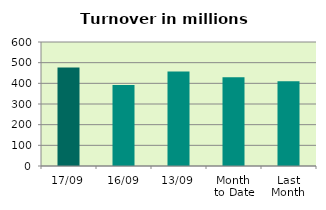
| Category | Series 0 |
|---|---|
| 17/09 | 476.192 |
| 16/09 | 392.123 |
| 13/09 | 457.665 |
| Month 
to Date | 429.664 |
| Last
Month | 410.207 |